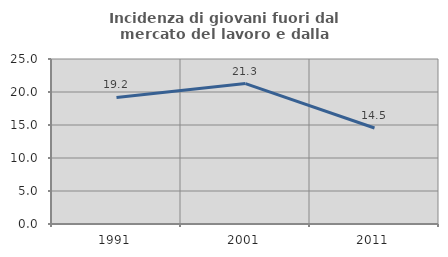
| Category | Incidenza di giovani fuori dal mercato del lavoro e dalla formazione  |
|---|---|
| 1991.0 | 19.174 |
| 2001.0 | 21.281 |
| 2011.0 | 14.54 |